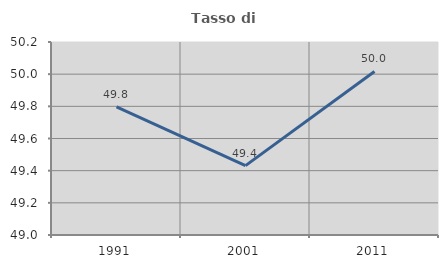
| Category | Tasso di occupazione   |
|---|---|
| 1991.0 | 49.797 |
| 2001.0 | 49.431 |
| 2011.0 | 50.017 |